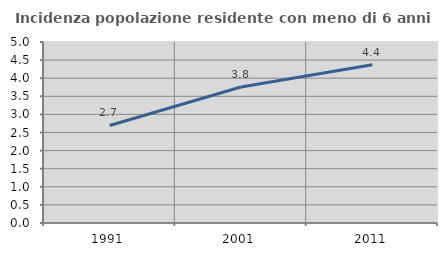
| Category | Incidenza popolazione residente con meno di 6 anni |
|---|---|
| 1991.0 | 2.695 |
| 2001.0 | 3.756 |
| 2011.0 | 4.369 |